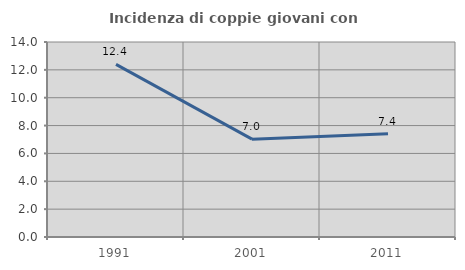
| Category | Incidenza di coppie giovani con figli |
|---|---|
| 1991.0 | 12.397 |
| 2001.0 | 7.025 |
| 2011.0 | 7.407 |